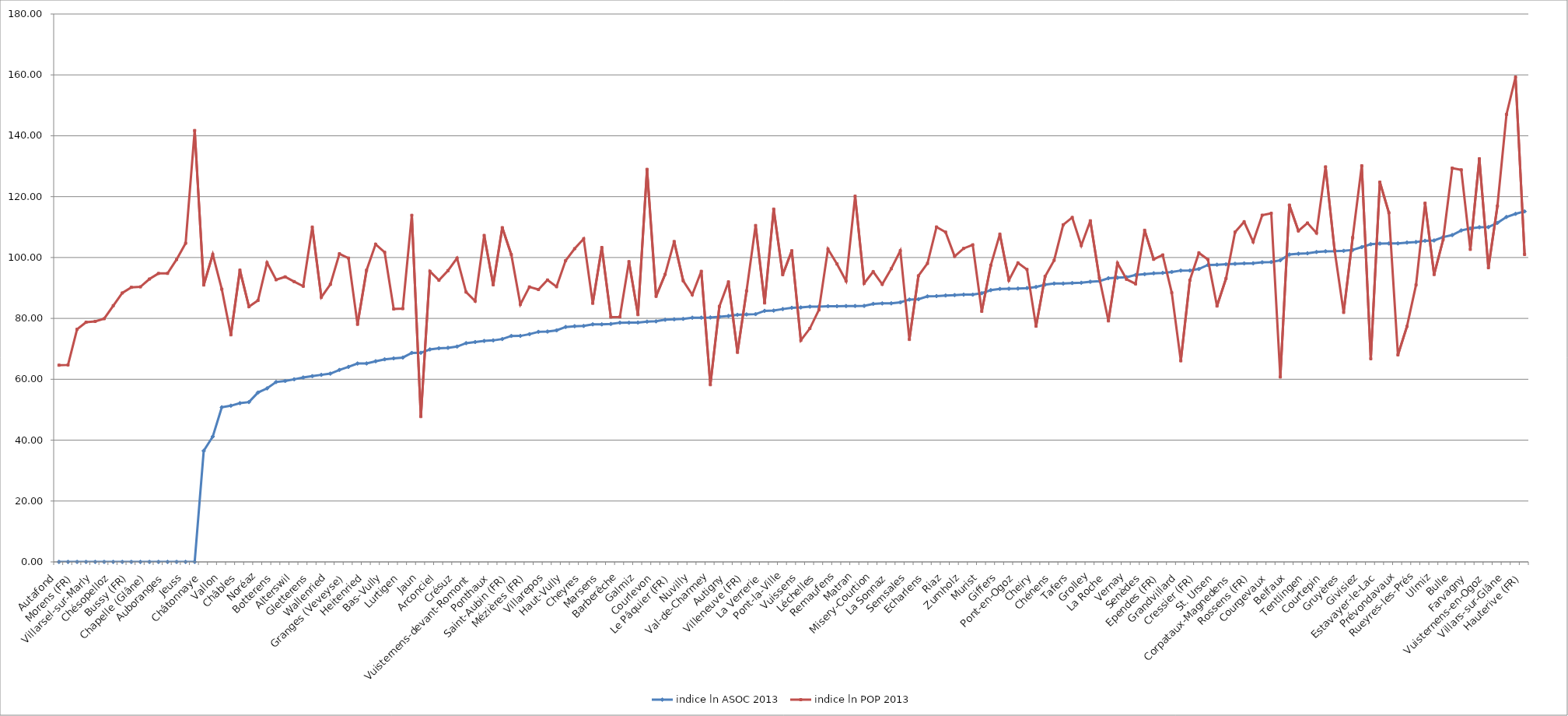
| Category | indice ln ASOC 2013 | indice ln POP 2013 |
|---|---|---|
| Autafond | 0 | 64.623 |
| Pierrafortscha | 0 | 64.713 |
| Morens (FR) | 0 | 76.414 |
| Russy | 0 | 78.752 |
| Villarsel-sur-Marly | 0 | 79.017 |
| Ecublens (FR) | 0 | 79.907 |
| Chésopelloz | 0 | 84.174 |
| Sévaz | 0 | 88.346 |
| Bussy (FR) | 0 | 90.212 |
| Corserey | 0 | 90.365 |
| Chapelle (Glâne) | 0 | 92.936 |
| Ried bei Kerzers | 0 | 94.763 |
| Auboranges | 0 | 94.791 |
| Greng | 0 | 99.348 |
| Jeuss | 0 | 104.691 |
| Meyriez | 0 | 141.731 |
| Châtonnaye | 36.493 | 90.96 |
| Kleinbösingen | 41.17 | 101.049 |
| Vallon | 50.792 | 89.585 |
| Le Châtelard | 51.31 | 74.6 |
| Châbles | 52.141 | 95.86 |
| Ménières | 52.507 | 83.847 |
| Noréaz | 55.645 | 85.896 |
| Gempenach | 57.001 | 98.311 |
| Botterens | 59.105 | 92.685 |
| Salvenach | 59.441 | 93.65 |
| Alterswil | 59.988 | 92.074 |
| Massonnens | 60.571 | 90.569 |
| Gletterens | 61.021 | 110.003 |
| La Folliaz | 61.458 | 86.953 |
| Wallenried | 61.856 | 91.178 |
| Brünisried | 63.072 | 101.238 |
| Granges (Veveyse) | 64.071 | 99.809 |
| Grangettes | 65.172 | 78.056 |
| Heitenried | 65.204 | 95.817 |
| Morlon | 65.92 | 104.366 |
| Bas-Vully | 66.558 | 101.713 |
| Sâles | 66.862 | 83.092 |
| Lurtigen | 67.132 | 83.203 |
| Corminboeuf | 68.67 | 113.862 |
| Jaun | 68.695 | 47.743 |
| Ueberstorf | 69.807 | 95.478 |
| Arconciel | 70.184 | 92.526 |
| Fräschels | 70.332 | 95.693 |
| Crésuz | 70.732 | 99.82 |
| Saint-Martin (FR) | 71.87 | 88.64 |
| Vuisternens-devant-Romont | 72.24 | 85.692 |
| Ferpicloz | 72.589 | 107.257 |
| Ponthaux | 72.776 | 91.037 |
| Châtillon (FR) | 73.219 | 109.815 |
| Saint-Aubin (FR) | 74.24 | 100.952 |
| Villorsonnens | 74.248 | 84.613 |
| Mézières (FR) | 74.812 | 90.339 |
| Siviriez | 75.587 | 89.479 |
| Villarepos | 75.685 | 92.612 |
| St. Antoni | 76.073 | 90.422 |
| Haut-Vully | 77.178 | 98.983 |
| Fétigny | 77.435 | 102.902 |
| Cheyres | 77.532 | 106.169 |
| Torny | 78.049 | 84.97 |
| Marsens | 78.049 | 103.292 |
| Surpierre | 78.157 | 80.439 |
| Barberêche | 78.589 | 80.501 |
| La Brillaz | 78.594 | 98.647 |
| Galmiz | 78.63 | 81.23 |
| Muntelier | 78.928 | 128.97 |
| Courlevon | 79.044 | 87.247 |
| Delley-Portalban | 79.551 | 94.467 |
| Le Pâquier (FR) | 79.699 | 105.257 |
| Montagny (FR) | 79.856 | 92.352 |
| Nuvilly | 80.224 | 87.775 |
| Rechthalten | 80.234 | 95.476 |
| Val-de-Charmey | 80.316 | 58.219 |
| Corbières | 80.557 | 83.943 |
| Autigny | 80.782 | 91.996 |
| Bas-Intyamon | 81.186 | 68.848 |
| Villeneuve (FR) | 81.297 | 89.015 |
| Attalens | 81.403 | 110.522 |
| La Verrerie | 82.482 | 85.071 |
| Neyruz (FR) | 82.571 | 115.903 |
| Pont-la-Ville | 83.063 | 94.357 |
| Vuadens | 83.484 | 102.223 |
| Vuissens | 83.596 | 72.79 |
| Hauteville | 83.867 | 76.693 |
| Léchelles | 83.876 | 82.798 |
| Oberschrot | 83.998 | 102.77 |
| Remaufens | 84.007 | 97.88 |
| Rue | 84.05 | 92.302 |
| Matran | 84.066 | 120.14 |
| Le Flon | 84.11 | 91.527 |
| Misery-Courtion | 84.78 | 95.341 |
| Sorens | 84.93 | 91.189 |
| La Sonnaz | 84.951 | 96.326 |
| Dompierre (FR) | 85.268 | 102.234 |
| Semsales | 86.191 | 73.084 |
| Billens-Hennens | 86.304 | 93.983 |
| Echarlens | 87.249 | 98.07 |
| Avry | 87.333 | 110.017 |
| Riaz | 87.534 | 108.336 |
| Lully (FR) | 87.641 | 100.389 |
| Zumholz | 87.796 | 102.983 |
| Gurmels | 87.802 | 104.166 |
| Murist | 88.27 | 82.333 |
| Le Mouret | 89.278 | 97.462 |
| Giffers | 89.675 | 107.693 |
| Châtel-sur-Montsalvens | 89.757 | 92.534 |
| Pont-en-Ogoz | 89.801 | 98.227 |
| Cugy (FR) | 89.957 | 96.071 |
| Cheiry | 90.334 | 77.433 |
| St. Silvester | 91.101 | 93.793 |
| Chénens | 91.445 | 99.082 |
| Domdidier | 91.456 | 110.746 |
| Tafers | 91.62 | 113.152 |
| Bösingen | 91.704 | 103.954 |
| Grolley | 92.044 | 112.071 |
| Les Montets | 92.261 | 93.23 |
| La Roche | 93.204 | 79.181 |
| Prez-vers-Noréaz | 93.365 | 98.151 |
| Vernay | 93.539 | 92.858 |
| Le Glèbe | 94.27 | 91.352 |
| Senèdes | 94.517 | 108.954 |
| Ursy | 94.811 | 99.405 |
| Ependes (FR) | 94.947 | 100.83 |
| Vaulruz | 95.259 | 88.435 |
| Grandvillard | 95.721 | 66.064 |
| Treyvaux | 95.728 | 92.523 |
| Cressier (FR) | 96.239 | 101.526 |
| Montet (Glâne) | 97.559 | 99.34 |
| St. Ursen | 97.638 | 84.058 |
| Châtel-Saint-Denis | 97.782 | 93.13 |
| Corpataux-Magnedens | 97.928 | 108.344 |
| Bossonnens | 98.07 | 111.725 |
| Rossens (FR) | 98.1 | 105.154 |
| Kerzers | 98.412 | 113.905 |
| Courgevaux | 98.524 | 114.519 |
| Haut-Intyamon | 99.105 | 60.748 |
| Belfaux | 100.979 | 117.22 |
| Schmitten (FR) | 101.229 | 108.745 |
| Tentlingen | 101.379 | 111.338 |
| Cottens (FR) | 101.819 | 108.035 |
| Courtepin | 102.044 | 129.781 |
| Villaz-Saint-Pierre | 102.062 | 102.385 |
| Gruyères | 102.195 | 81.964 |
| Düdingen | 102.496 | 106.578 |
| Givisiez | 103.432 | 130.135 |
| Plaffeien | 104.368 | 66.745 |
| Estavayer-le-Lac | 104.588 | 124.76 |
| Wünnewil-Flamatt | 104.622 | 114.706 |
| Prévondavaux | 104.638 | 68.004 |
| Plasselb | 104.907 | 77.375 |
| Rueyres-les-Prés | 105.095 | 90.989 |
| Murten | 105.497 | 117.848 |
| Ulmiz | 105.598 | 94.414 |
| Broc | 106.723 | 105.915 |
| Bulle | 107.37 | 129.352 |
| Granges-Paccot | 108.907 | 128.792 |
| Farvagny | 109.563 | 102.673 |
| Marly | 109.946 | 132.438 |
| Vuisternens-en-Ogoz | 109.998 | 96.647 |
| Romont (FR) | 111.381 | 116.979 |
| Villars-sur-Glâne | 113.32 | 147.015 |
| Fribourg | 114.361 | 159.29 |
| Hauterive (FR) | 115.145 | 100.992 |